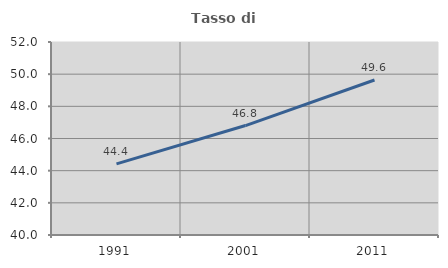
| Category | Tasso di occupazione   |
|---|---|
| 1991.0 | 44.422 |
| 2001.0 | 46.805 |
| 2011.0 | 49.636 |